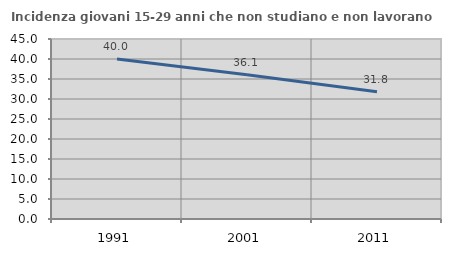
| Category | Incidenza giovani 15-29 anni che non studiano e non lavorano  |
|---|---|
| 1991.0 | 40.023 |
| 2001.0 | 36.051 |
| 2011.0 | 31.838 |